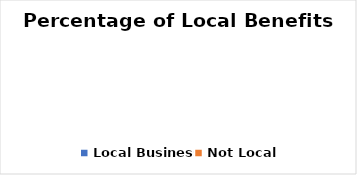
| Category | % |
|---|---|
| Local Business | 0 |
| Not Local | 0 |